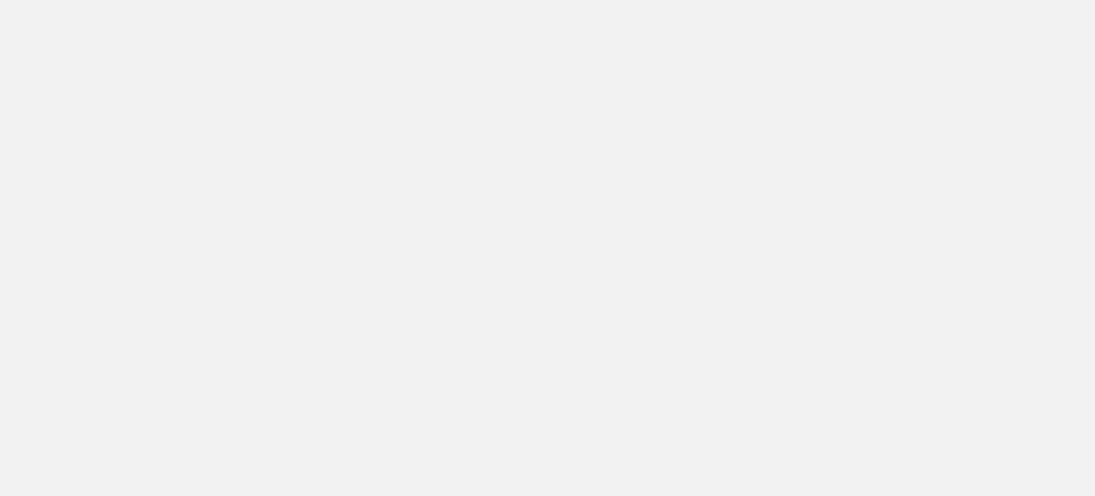
| Category | Total |
|---|---|
| Al Hodeidah | 77199 |
| Hajjah | 72452 |
| Marib | 49819 |
| Al Jawf | 14118 |
| Taiz | 13514 |
| Hadramawt | 8309 |
| Sadah | 5304 |
| Lahj | 4950 |
| Abyan | 4181 |
| Amran | 4179 |
| Sanaa | 3892 |
| Ad Dali | 3777 |
| Aden | 3449 |
| Ibb | 2708 |
| Dhamar | 2053 |
| Al Bayda | 1890 |
| Al Mahwit | 1331 |
| Shabwah | 1015 |
| Al Maharah | 457 |
| Raymah | 451 |
| Sanaa City | 167 |
| Socotra | 15 |